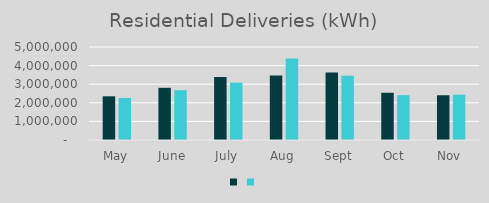
| Category | Series 1 | Series 0 |
|---|---|---|
| May | 2348338 | 2261286 |
| June | 2806791 | 2677737 |
| July | 3385366 | 3081914 |
| Aug | 3470448 | 4380548 |
| Sept | 3631455 | 3458199 |
| Oct | 2538922 | 2411671 |
| Nov | 2405818 | 2434730 |